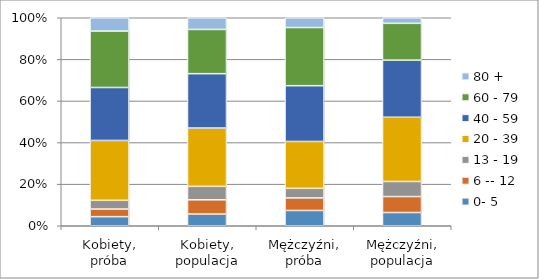
| Category | 0- 5 | 6 -- 12 | 13 - 19 | 20 - 39 | 40 - 59 | 60 - 79 | 80 + |
|---|---|---|---|---|---|---|---|
| Kobiety, próba | 0.044 | 0.037 | 0.042 | 0.288 | 0.255 | 0.271 | 0.064 |
| Kobiety, populacja | 0.056 | 0.068 | 0.065 | 0.28 | 0.261 | 0.213 | 0.056 |
| Mężczyźni, próba | 0.073 | 0.06 | 0.046 | 0.225 | 0.268 | 0.28 | 0.047 |
| Mężczyźni, populacja | 0.064 | 0.077 | 0.072 | 0.309 | 0.275 | 0.177 | 0.027 |